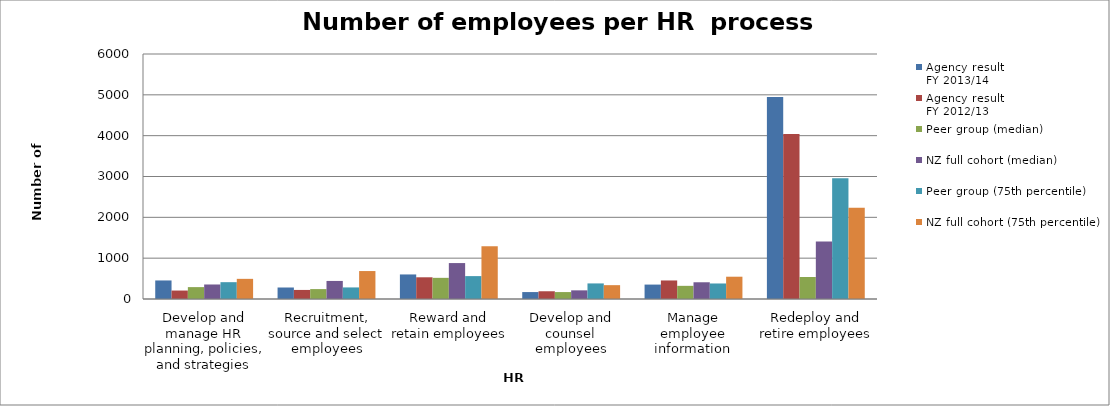
| Category | Agency result
FY 2013/14 | Agency result
FY 2012/13 | Peer group (median) | NZ full cohort (median) | Peer group (75th percentile) | NZ full cohort (75th percentile) |
|---|---|---|---|---|---|---|
| Develop and manage HR planning, policies, and strategies | 454.082 | 207.18 | 291 | 355.441 | 411.981 | 493.565 |
| Recruitment, source and select employees | 281.646 | 221.978 | 242.5 | 442.249 | 283.323 | 684.506 |
| Reward and retain employees | 601.351 | 531.579 | 518.182 | 879.906 | 560.643 | 1293.146 |
| Develop and counsel employees | 169.847 | 189.671 | 169.847 | 211.9 | 381.476 | 338.973 |
| Manage employee information | 353.175 | 453.933 | 322.222 | 409.714 | 380.159 | 545.939 |
| Redeploy and retire employees | 4944.444 | 4040 | 539.286 | 1409.853 | 2957.222 | 2236.305 |